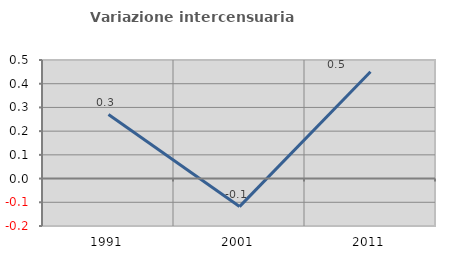
| Category | Variazione intercensuaria annua |
|---|---|
| 1991.0 | 0.27 |
| 2001.0 | -0.118 |
| 2011.0 | 0.451 |